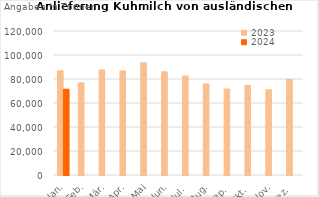
| Category | 2023 | 2024 |
|---|---|---|
| Jan. | 86873.199 | 71508.229 |
| Feb. | 76778.085 | 0 |
| Mär. | 87564.068 | 0 |
| Apr. | 86747.855 | 0 |
| Mai | 93469.071 | 0 |
| Jun. | 86016.792 | 0 |
| Jul. | 82462.839 | 0 |
| Aug. | 75905.162 | 0 |
| Sep. | 71675.928 | 0 |
| Okt. | 74661.604 | 0 |
| Nov. | 70996.025 | 0 |
| Dez. | 79661.542 | 0 |